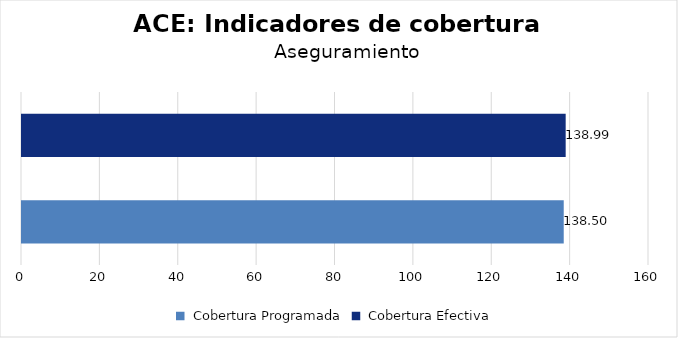
| Category | Aseguramiento |
|---|---|
| Cobertura Programada | 138.496 |
| Cobertura Efectiva | 138.993 |